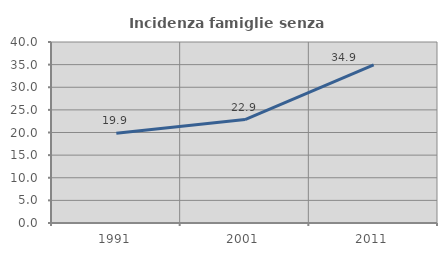
| Category | Incidenza famiglie senza nuclei |
|---|---|
| 1991.0 | 19.858 |
| 2001.0 | 22.869 |
| 2011.0 | 34.932 |